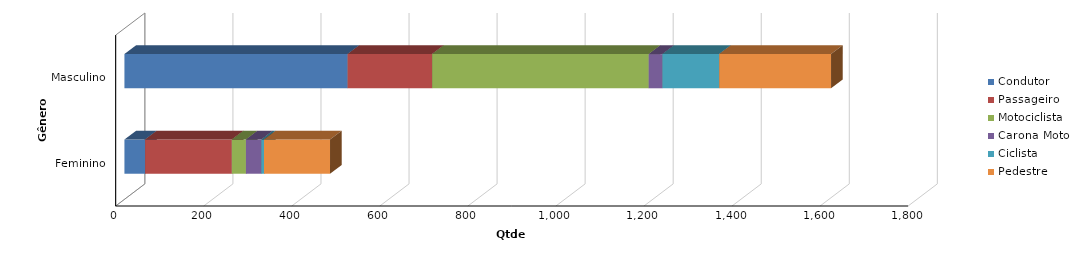
| Category | Condutor | Passageiro | Motociclista | Carona Moto | Ciclista | Pedestre |
|---|---|---|---|---|---|---|
| Feminino | 47 | 197 | 32 | 35 | 6 | 150 |
| Masculino | 507 | 192 | 492 | 31 | 129 | 254 |